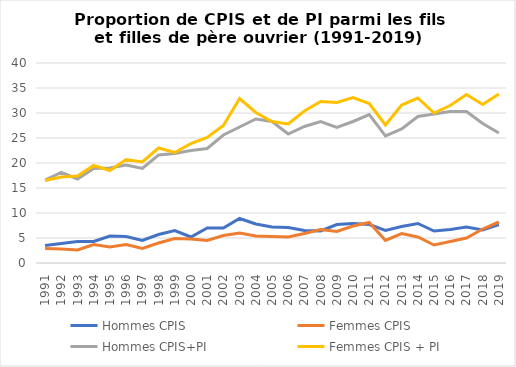
| Category | Hommes CPIS | Femmes CPIS | Hommes CPIS+PI | Femmes CPIS + PI |
|---|---|---|---|---|
| 1991.0 | 3.5 | 2.9 | 16.6 | 16.5 |
| 1992.0 | 3.9 | 2.8 | 18.1 | 17.2 |
| 1993.0 | 4.3 | 2.6 | 16.8 | 17.4 |
| 1994.0 | 4.3 | 3.7 | 18.9 | 19.5 |
| 1995.0 | 5.4 | 3.2 | 19 | 18.5 |
| 1996.0 | 5.3 | 3.7 | 19.6 | 20.7 |
| 1997.0 | 4.5 | 2.9 | 18.9 | 20.2 |
| 1998.0 | 5.7 | 4 | 21.6 | 23 |
| 1999.0 | 6.5 | 4.9 | 21.9 | 22.1 |
| 2000.0 | 5.2 | 4.8 | 22.5 | 23.9 |
| 2001.0 | 7 | 4.5 | 22.9 | 25.1 |
| 2002.0 | 7 | 5.5 | 25.6 | 27.5 |
| 2003.0 | 8.9 | 6 | 27.2 | 32.9 |
| 2004.0 | 7.8 | 5.4 | 28.8 | 30.1 |
| 2005.0 | 7.2 | 5.3 | 28.3 | 28.3 |
| 2006.0 | 7.1 | 5.2 | 25.8 | 27.8 |
| 2007.0 | 6.5 | 5.9 | 27.3 | 30.4 |
| 2008.0 | 6.4 | 6.7 | 28.3 | 32.3 |
| 2009.0 | 7.7 | 6.3 | 27.1 | 32.1 |
| 2010.0 | 7.9 | 7.4 | 28.3 | 33.1 |
| 2011.0 | 7.7 | 8.1 | 29.7 | 31.9 |
| 2012.0 | 6.5 | 4.5 | 25.4 | 27.6 |
| 2013.0 | 7.3 | 5.9 | 26.8 | 31.6 |
| 2014.0 | 7.9 | 5.2 | 29.3 | 33 |
| 2015.0 | 6.4 | 3.6 | 29.8 | 30 |
| 2016.0 | 6.7 | 4.3 | 30.3 | 31.5 |
| 2017.0 | 7.2 | 5 | 30.3 | 33.7 |
| 2018.0 | 6.6 | 6.8 | 27.9 | 31.7 |
| 2019.0 | 7.7 | 8.2 | 26 | 33.8 |